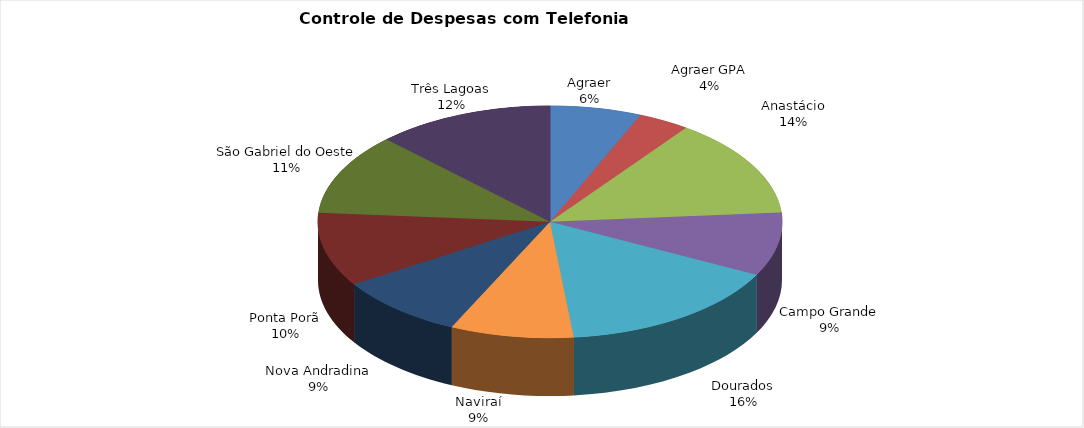
| Category | TOTAL |
|---|---|
| Agraer | 23269.63 |
| Agraer GPA | 13112.44 |
| Anastácio | 50313.66 |
| Campo Grande | 32317.64 |
| Dourados | 57924.74 |
| Naviraí | 31353.98 |
| Nova Andradina | 32995.3 |
| Ponta Porã | 37665.72 |
| São Gabriel do Oeste | 41382.97 |
| Três Lagoas | 45432.43 |